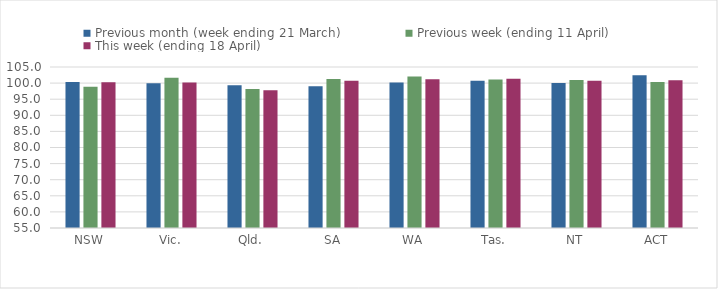
| Category | Previous month (week ending 21 March) | Previous week (ending 11 April) | This week (ending 18 April) |
|---|---|---|---|
| NSW | 100.344 | 98.889 | 100.28 |
| Vic. | 99.964 | 101.679 | 100.148 |
| Qld. | 99.299 | 98.197 | 97.816 |
| SA | 99.016 | 101.246 | 100.764 |
| WA | 100.171 | 102.082 | 101.159 |
| Tas. | 100.707 | 101.111 | 101.312 |
| NT | 100 | 100.948 | 100.739 |
| ACT | 102.456 | 100.351 | 100.853 |